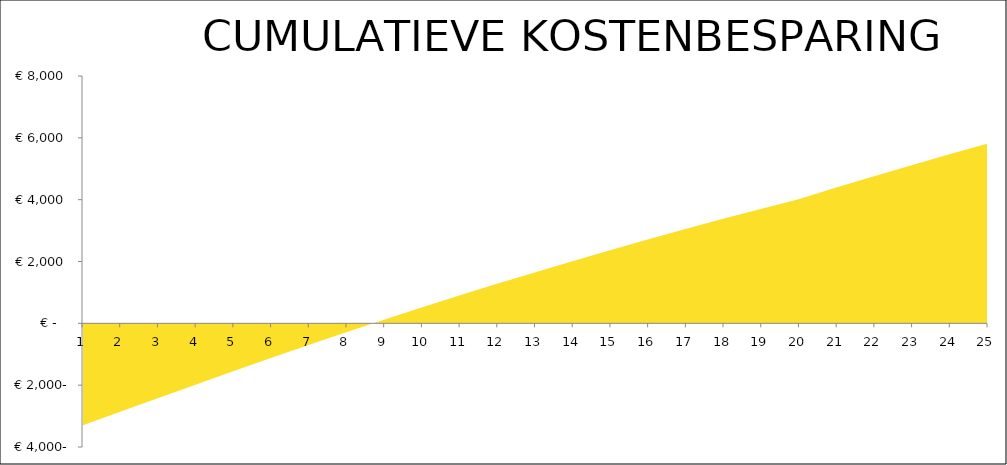
| Category | cumulatief |
|---|---|
| 0 | -3295.304 |
| 1 | -2852.656 |
| 2 | -2413.228 |
| 3 | -1977.023 |
| 4 | -1544.04 |
| 5 | -1114.281 |
| 6 | -693.135 |
| 7 | -280.547 |
| 8 | 123.54 |
| 9 | 519.183 |
| 10 | 906.439 |
| 11 | 1285.366 |
| 12 | 1656.022 |
| 13 | 2018.466 |
| 14 | 2372.757 |
| 15 | 2718.957 |
| 16 | 3057.125 |
| 17 | 3387.323 |
| 18 | 3709.615 |
| 19 | 4024.062 |
| 20 | 4397.884 |
| 21 | 4763.991 |
| 22 | 5122.449 |
| 23 | 5473.325 |
| 24 | 5816.686 |